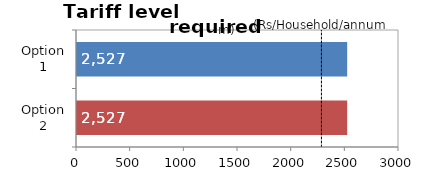
| Category | Series 0 |
|---|---|
| Option 2 | 2526.556 |
| Option 1 | 2526.556 |